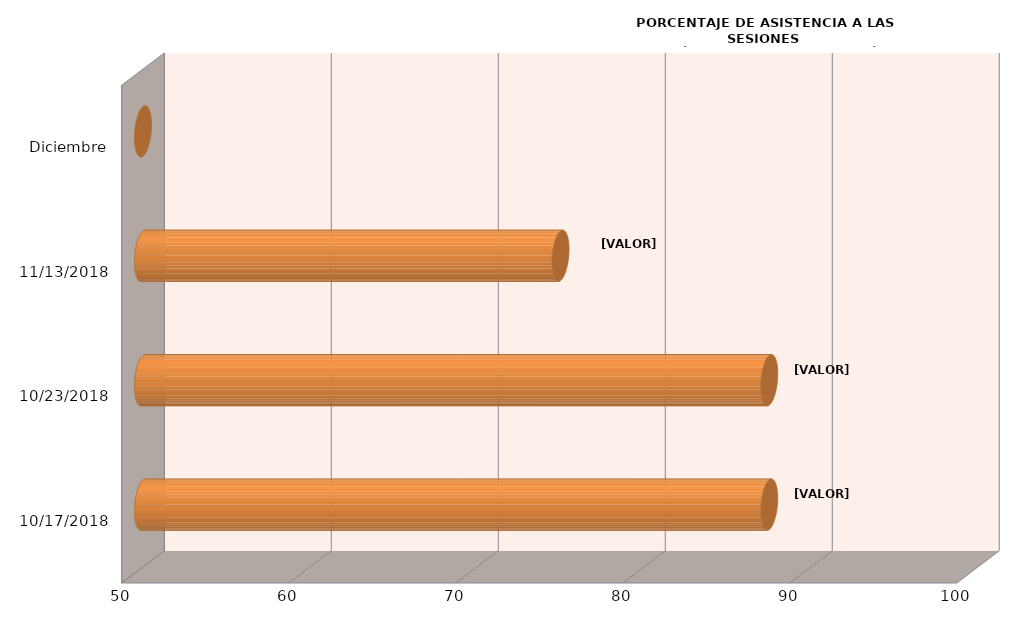
| Category | Series 0 |
|---|---|
| 17/10/2018 | 87.5 |
| 23/10/2018 | 87.5 |
| 13/11/2018 | 75 |
| Diciembre | 0 |